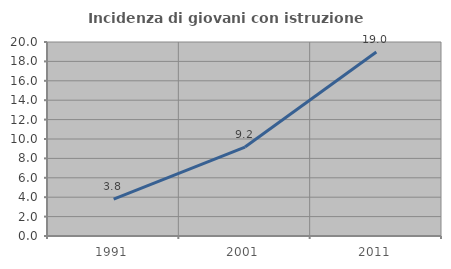
| Category | Incidenza di giovani con istruzione universitaria |
|---|---|
| 1991.0 | 3.794 |
| 2001.0 | 9.17 |
| 2011.0 | 18.97 |